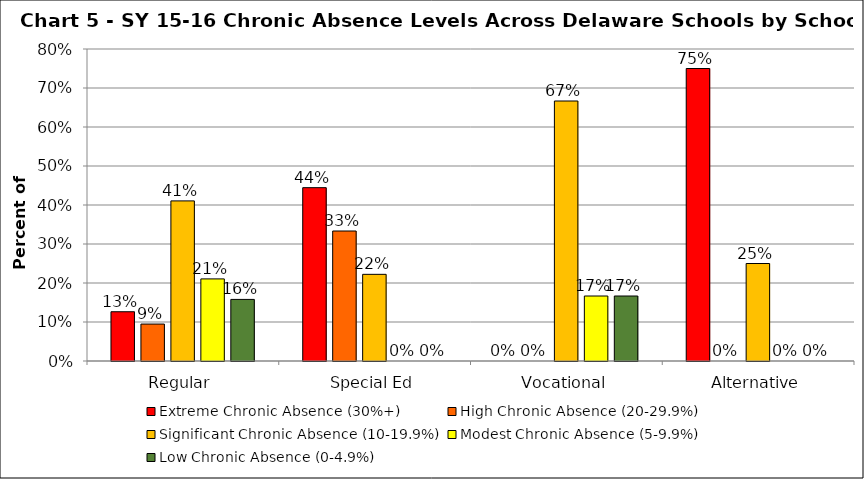
| Category | Extreme Chronic Absence (30%+) | High Chronic Absence (20-29.9%) | Significant Chronic Absence (10-19.9%) | Modest Chronic Absence (5-9.9%) | Low Chronic Absence (0-4.9%) |
|---|---|---|---|---|---|
| 0 | 0.126 | 0.095 | 0.411 | 0.211 | 0.158 |
| 1 | 0.444 | 0.333 | 0.222 | 0 | 0 |
| 2 | 0 | 0 | 0.667 | 0.167 | 0.167 |
| 3 | 0.75 | 0 | 0.25 | 0 | 0 |